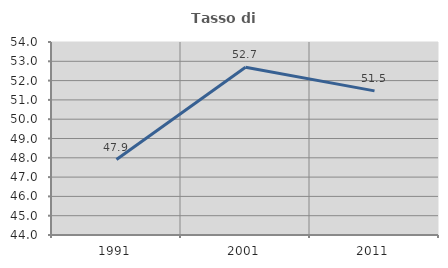
| Category | Tasso di occupazione   |
|---|---|
| 1991.0 | 47.908 |
| 2001.0 | 52.691 |
| 2011.0 | 51.467 |